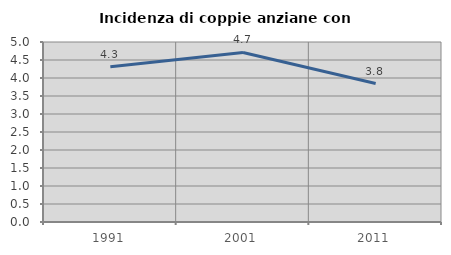
| Category | Incidenza di coppie anziane con figli |
|---|---|
| 1991.0 | 4.314 |
| 2001.0 | 4.71 |
| 2011.0 | 3.846 |